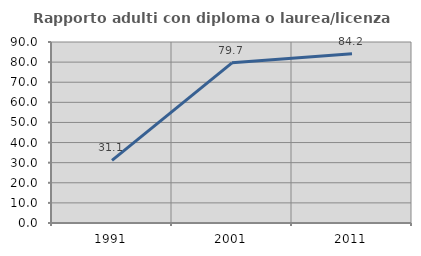
| Category | Rapporto adulti con diploma o laurea/licenza media  |
|---|---|
| 1991.0 | 31.138 |
| 2001.0 | 79.661 |
| 2011.0 | 84.178 |